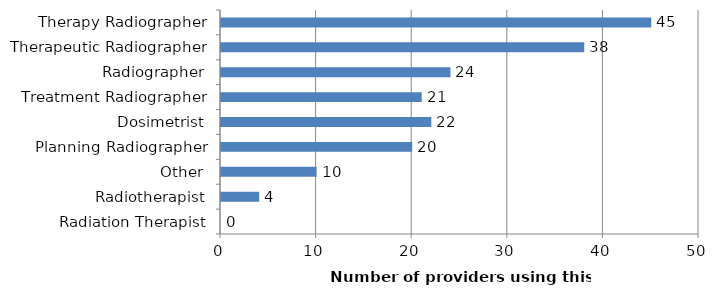
| Category | Number of providers using this title |
|---|---|
| Radiation Therapist | 0 |
| Radiotherapist | 4 |
| Other | 10 |
| Planning Radiographer | 20 |
| Dosimetrist | 22 |
| Treatment Radiographer | 21 |
| Radiographer | 24 |
| Therapeutic Radiographer | 38 |
| Therapy Radiographer | 45 |